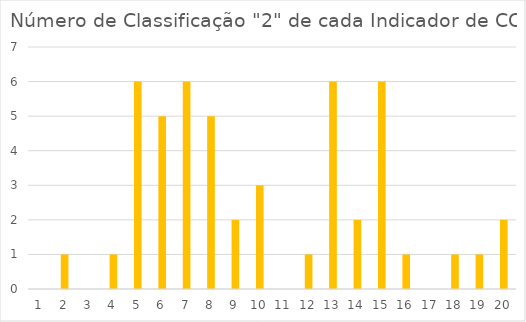
| Category | Series 0 |
|---|---|
| 0 | 0 |
| 1 | 1 |
| 2 | 0 |
| 3 | 1 |
| 4 | 6 |
| 5 | 5 |
| 6 | 6 |
| 7 | 5 |
| 8 | 2 |
| 9 | 3 |
| 10 | 0 |
| 11 | 1 |
| 12 | 6 |
| 13 | 2 |
| 14 | 6 |
| 15 | 1 |
| 16 | 0 |
| 17 | 1 |
| 18 | 1 |
| 19 | 2 |